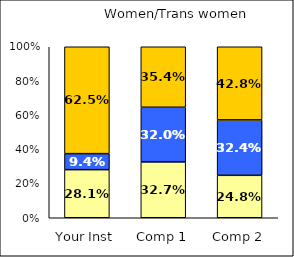
| Category | Low Respect | Average Respect | High Respect |
|---|---|---|---|
| Your Inst | 0.281 | 0.094 | 0.625 |
| Comp 1 | 0.327 | 0.32 | 0.354 |
| Comp 2 | 0.248 | 0.324 | 0.428 |